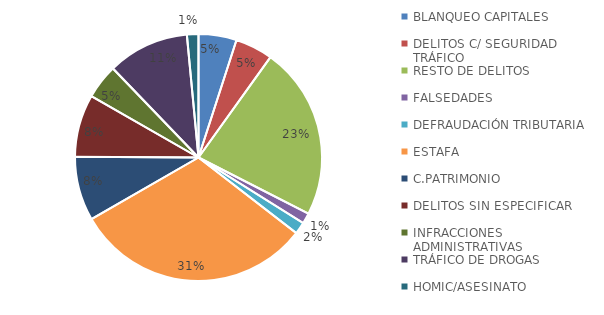
| Category | Nº |
|---|---|
| BLANQUEO CAPITALES | 496 |
| DELITOS C/ SEGURIDAD TRÁFICO | 490 |
| RESTO DE DELITOS | 2254 |
| FALSEDADES | 137 |
| DEFRAUDACIÓN TRIBUTARIA | 157 |
| ESTAFA | 3110 |
| C.PATRIMONIO | 836 |
| DELITOS SIN ESPECIFICAR | 816 |
| INFRACCIONES ADMINISTRATIVAS | 452 |
| TRÁFICO DE DROGAS | 1064 |
| HOMIC/ASESINATO | 150 |